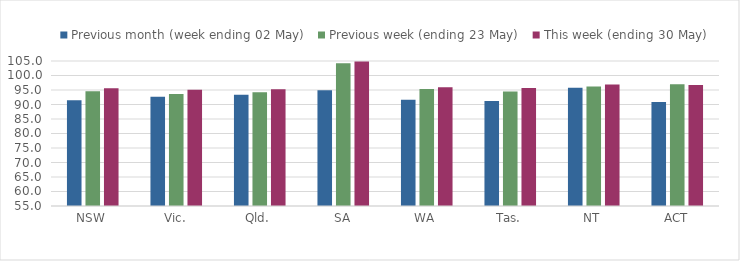
| Category | Previous month (week ending 02 May) | Previous week (ending 23 May) | This week (ending 30 May) |
|---|---|---|---|
| NSW | 91.442 | 94.532 | 95.6 |
| Vic. | 92.657 | 93.599 | 95.082 |
| Qld. | 93.367 | 94.219 | 95.242 |
| SA | 94.922 | 104.258 | 104.803 |
| WA | 91.606 | 95.311 | 95.99 |
| Tas. | 91.19 | 94.448 | 95.73 |
| NT | 95.776 | 96.169 | 96.857 |
| ACT | 90.865 | 96.949 | 96.697 |